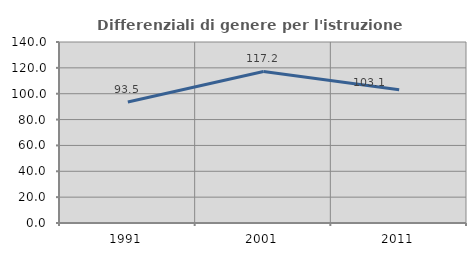
| Category | Differenziali di genere per l'istruzione superiore |
|---|---|
| 1991.0 | 93.526 |
| 2001.0 | 117.248 |
| 2011.0 | 103.12 |